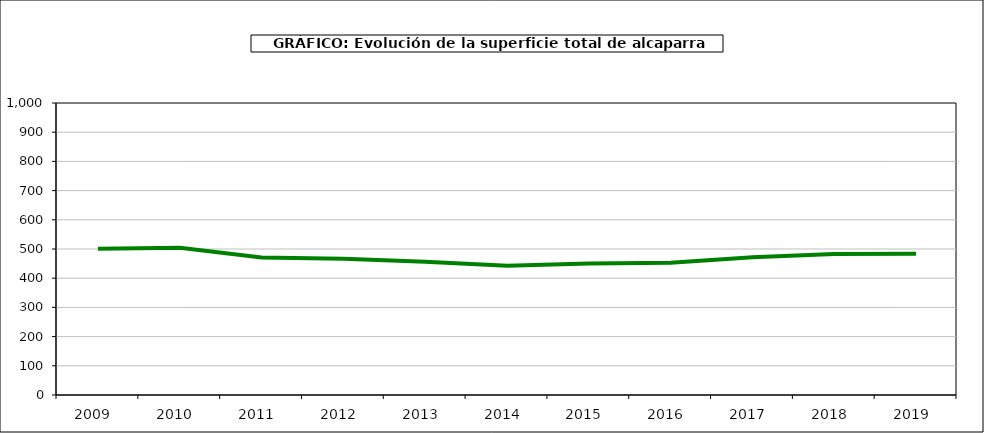
| Category | superficie |
|---|---|
| 2009.0 | 501 |
| 2010.0 | 504 |
| 2011.0 | 471 |
| 2012.0 | 467 |
| 2013.0 | 456 |
| 2014.0 | 443 |
| 2015.0 | 450 |
| 2016.0 | 453 |
| 2017.0 | 472 |
| 2018.0 | 483 |
| 2019.0 | 484 |